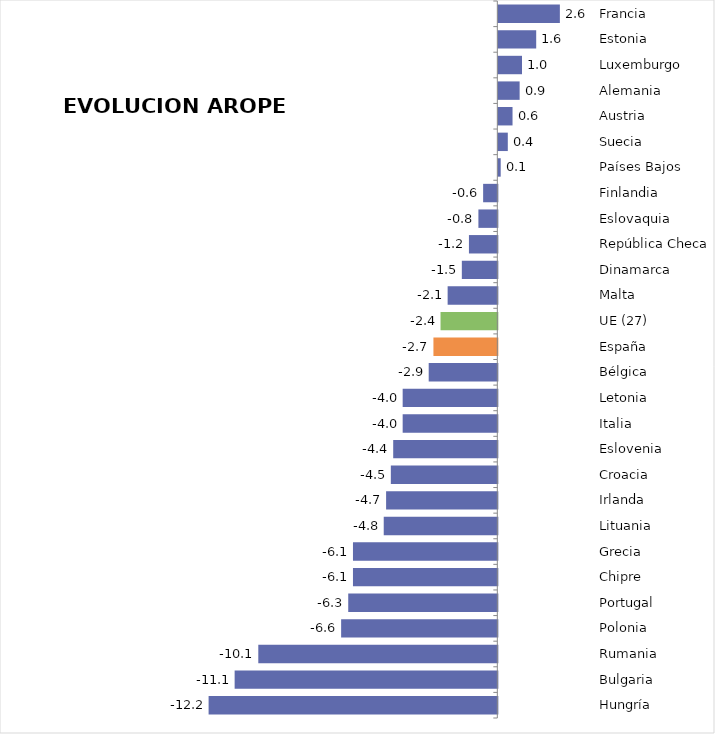
| Category | Series 0 |
|---|---|
| Hungría | -12.2 |
| Bulgaria | -11.1 |
| Rumania | -10.1 |
| Polonia | -6.6 |
| Portugal | -6.3 |
| Chipre | -6.1 |
| Grecia | -6.1 |
| Lituania | -4.8 |
| Irlanda | -4.7 |
| Croacia | -4.5 |
| Eslovenia | -4.4 |
| Italia | -4 |
| Letonia | -4 |
| Bélgica | -2.9 |
| España | -2.7 |
| UE (27) | -2.4 |
| Malta | -2.1 |
| Dinamarca | -1.5 |
| República Checa | -1.2 |
| Eslovaquia | -0.8 |
| Finlandia | -0.6 |
| Países Bajos | 0.1 |
| Suecia | 0.4 |
| Austria | 0.6 |
| Alemania | 0.9 |
| Luxemburgo | 1 |
| Estonia | 1.6 |
| Francia | 2.6 |